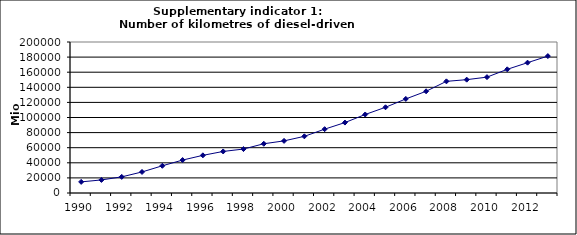
| Category | Number of kilometres of diesel-driven passenger cars, Mio km |
|---|---|
| 1990 | 14720.439 |
| 1991 | 17311.202 |
| 1992 | 21365.834 |
| 1993 | 27875.258 |
| 1994 | 36036.084 |
| 1995 | 43621.394 |
| 1996 | 49883.53 |
| 1997 | 55044.56 |
| 1998 | 58197.523 |
| 1999 | 65220.18 |
| 2000 | 69023.742 |
| 2001 | 75042.05 |
| 2002 | 84555.048 |
| 2003 | 93289.909 |
| 2004 | 103990.421 |
| 2005 | 113535.794 |
| 2006 | 124592.989 |
| 2007 | 134721.355 |
| 2008 | 147870.378 |
| 2009 | 150108.391 |
| 2010 | 153458.566 |
| 2011 | 163824.438 |
| 2012 | 172623.603 |
| 2013 | 181329.155 |